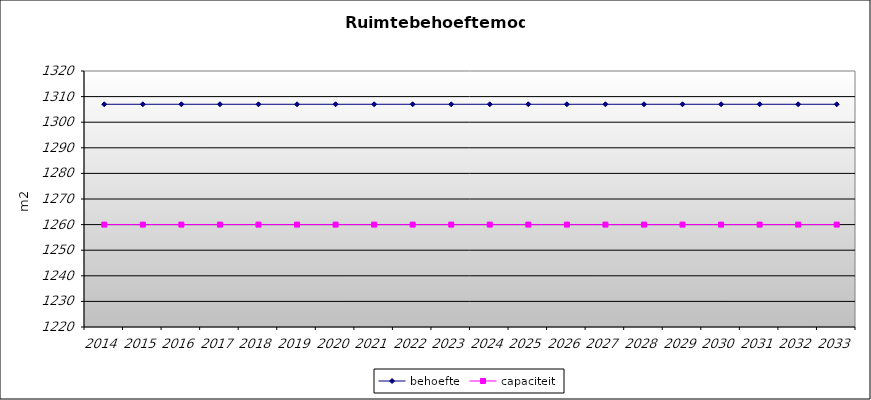
| Category | behoefte | capaciteit |
|---|---|---|
| 2014.0 | 1307 | 1260 |
| 2015.0 | 1307 | 1260 |
| 2016.0 | 1307 | 1260 |
| 2017.0 | 1307 | 1260 |
| 2018.0 | 1307 | 1260 |
| 2019.0 | 1307 | 1260 |
| 2020.0 | 1307 | 1260 |
| 2021.0 | 1307 | 1260 |
| 2022.0 | 1307 | 1260 |
| 2023.0 | 1307 | 1260 |
| 2024.0 | 1307 | 1260 |
| 2025.0 | 1307 | 1260 |
| 2026.0 | 1307 | 1260 |
| 2027.0 | 1307 | 1260 |
| 2028.0 | 1307 | 1260 |
| 2029.0 | 1307 | 1260 |
| 2030.0 | 1307 | 1260 |
| 2031.0 | 1307 | 1260 |
| 2032.0 | 1307 | 1260 |
| 2033.0 | 1307 | 1260 |